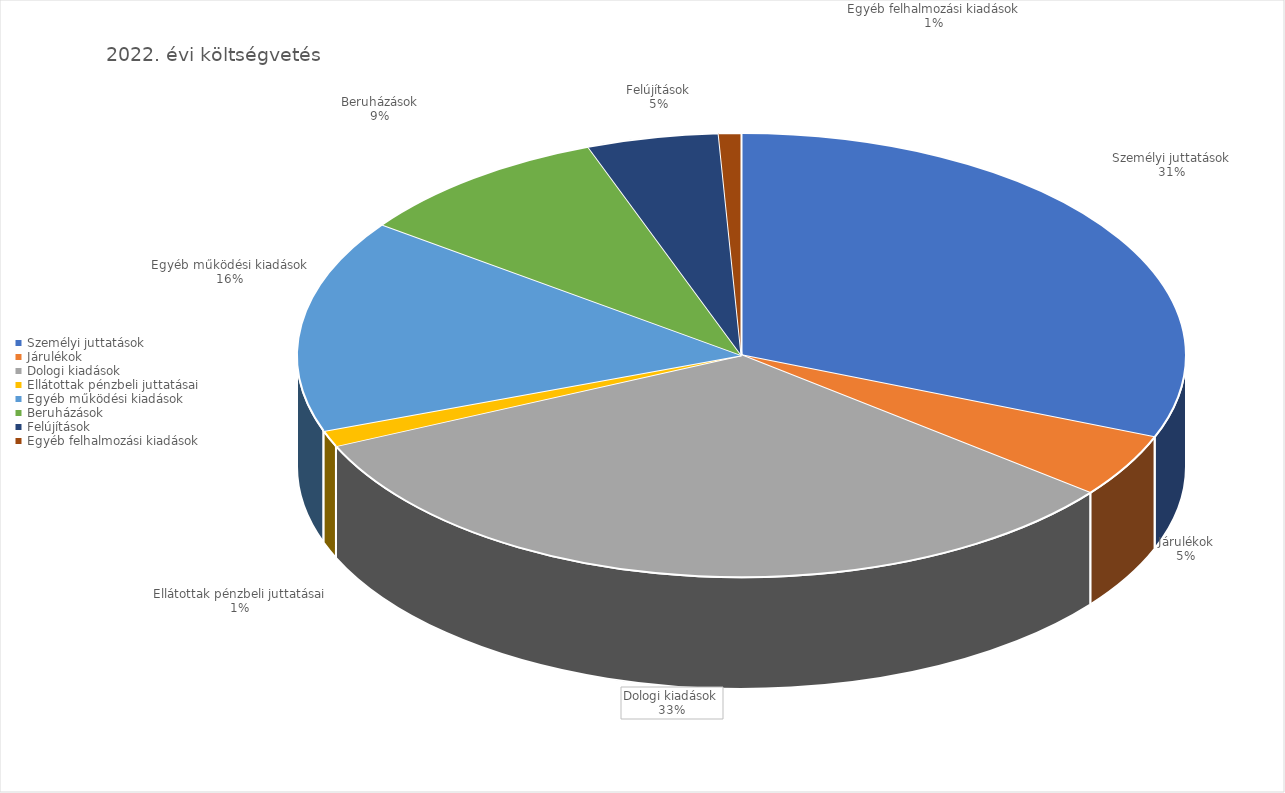
| Category | 2022 |
|---|---|
| Személyi juttatások | 11342642101 |
| Járulékok | 1690644768 |
| Dologi kiadások | 11934219707 |
| Ellátottak pénzbeli juttatásai | 430280877 |
| Egyéb működési kiadások | 5681443890 |
| Beruházások | 3433628329 |
| Felújítások | 1750613560 |
| Egyéb felhalmozási kiadások | 300231670 |